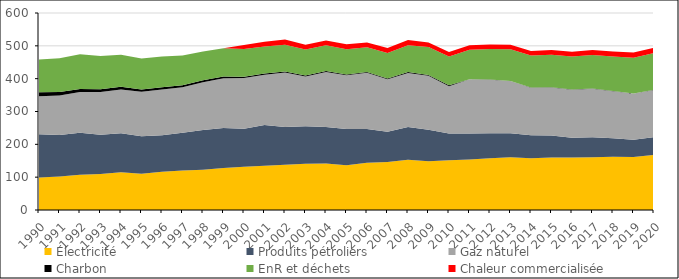
| Category | Électricité | Produits pétroliers | Gaz naturel | Charbon | EnR et déchets | Chaleur commercialisée |
|---|---|---|---|---|---|---|
| 1990.0 | 99.087 | 131.332 | 115.904 | 12.445 | 99.655 | 0 |
| 1991.0 | 101.76 | 126.67 | 120.418 | 10.458 | 103.092 | 0 |
| 1992.0 | 107.709 | 127.788 | 124.01 | 9.305 | 105.328 | 0 |
| 1993.0 | 109.567 | 119.565 | 129.988 | 8.505 | 101.584 | 0 |
| 1994.0 | 114.816 | 118.849 | 133.247 | 8.21 | 97.886 | 0 |
| 1995.0 | 110.138 | 114.352 | 135.306 | 6.875 | 94.91 | 0 |
| 1996.0 | 116.314 | 111.506 | 139.202 | 6.595 | 93.765 | 0 |
| 1997.0 | 120.354 | 114.712 | 138.534 | 6.325 | 90.953 | 0 |
| 1998.0 | 122.51 | 120.919 | 146.018 | 5.478 | 87.8 | 0 |
| 1999.0 | 127.788 | 122.207 | 151.473 | 5.221 | 85.577 | 0 |
| 2000.0 | 131.431 | 115.836 | 154.438 | 4.349 | 84.128 | 12.259 |
| 2001.0 | 134.716 | 124.496 | 152.358 | 4.238 | 82.411 | 14.495 |
| 2002.0 | 137.697 | 114.903 | 166.522 | 2.945 | 81.604 | 15.574 |
| 2003.0 | 140.949 | 114.208 | 151.511 | 2.891 | 79.626 | 14.457 |
| 2004.0 | 141.568 | 111.319 | 167.334 | 2.804 | 78.822 | 14.536 |
| 2005.0 | 136.548 | 110.317 | 163.56 | 2.521 | 76.675 | 15.415 |
| 2006.0 | 143.771 | 103.112 | 171 | 2.448 | 75.07 | 14.553 |
| 2007.0 | 146.015 | 92.019 | 159.919 | 2.388 | 77.961 | 15.101 |
| 2008.0 | 153.384 | 99.59 | 164.39 | 2.645 | 81.531 | 15.933 |
| 2009.0 | 148.715 | 95.541 | 164.484 | 2.336 | 85.006 | 13.828 |
| 2010.0 | 151.583 | 81.47 | 143.982 | 2.621 | 88.029 | 13.803 |
| 2011.0 | 153.505 | 79.617 | 164.778 | 0.47 | 89.446 | 13.928 |
| 2012.0 | 157.325 | 76.5 | 163.147 | 0.524 | 92.782 | 13.663 |
| 2013.0 | 160.611 | 73.375 | 158.575 | 0.551 | 96.693 | 13.791 |
| 2014.0 | 157.406 | 70.463 | 144.813 | 0.408 | 97.773 | 13.563 |
| 2015.0 | 159.688 | 67.372 | 146.155 | 0.422 | 98.871 | 14.506 |
| 2016.0 | 159.931 | 59.997 | 146.671 | 0.438 | 100.102 | 14.661 |
| 2017.0 | 160.717 | 61.023 | 147.823 | 0.413 | 102.17 | 14.957 |
| 2018.0 | 162.095 | 56.125 | 143.77 | 0.306 | 104.876 | 15.539 |
| 2019.0 | 161.209 | 52.642 | 140.829 | 0.284 | 108.838 | 15.755 |
| 2020.0 | 167.673 | 54.649 | 143.118 | 0.241 | 112.483 | 15.98 |